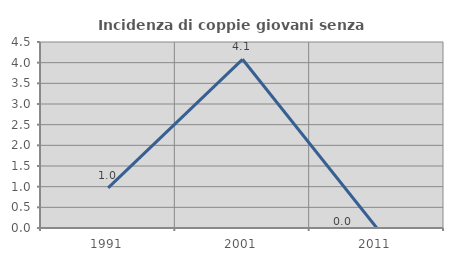
| Category | Incidenza di coppie giovani senza figli |
|---|---|
| 1991.0 | 0.971 |
| 2001.0 | 4.082 |
| 2011.0 | 0 |